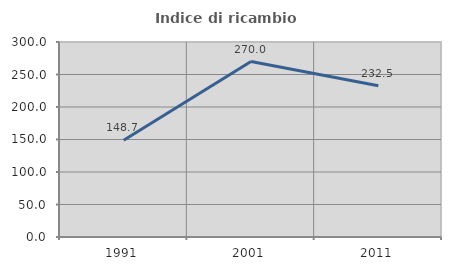
| Category | Indice di ricambio occupazionale  |
|---|---|
| 1991.0 | 148.734 |
| 2001.0 | 270 |
| 2011.0 | 232.544 |